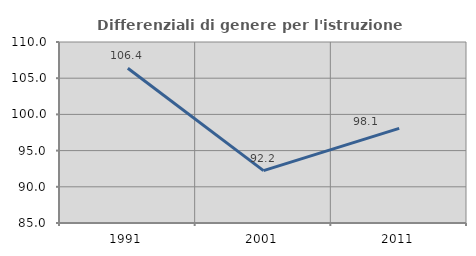
| Category | Differenziali di genere per l'istruzione superiore |
|---|---|
| 1991.0 | 106.37 |
| 2001.0 | 92.24 |
| 2011.0 | 98.079 |